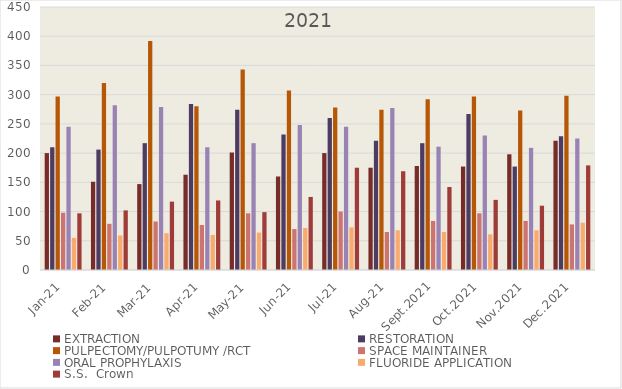
| Category | EXTRACTION | RESTORATION | PULPECTOMY/PULPOTUMY /RCT | SPACE MAINTAINER | ORAL PROPHYLAXIS | FLUORIDE APPLICATION | S.S.  Crown  |
|---|---|---|---|---|---|---|---|
| Jan-21 | 200 | 210 | 297 | 98 | 245 | 55 | 97 |
| Feb-21 | 151 | 206 | 320 | 79 | 282 | 59 | 102 |
| Mar-21 | 147 | 217 | 392 | 83 | 279 | 63 | 117 |
| Apr-21 | 163 | 284 | 280 | 77 | 210 | 60 | 119 |
| May-21 | 201 | 274 | 343 | 97 | 217 | 64 | 99 |
| Jun-21 | 160 | 232 | 307 | 70 | 248 | 72 | 125 |
| Jul-21 | 200 | 260 | 278 | 100 | 245 | 73 | 175 |
| Aug-21 | 175 | 221 | 274 | 65 | 277 | 68 | 169 |
| Sept.2021 | 178 | 217 | 292 | 84 | 211 | 65 | 142 |
| Oct.2021 | 177 | 267 | 297 | 97 | 230 | 61 | 120 |
| Nov.2021 | 198 | 177 | 273 | 84 | 209 | 68 | 110 |
| Dec.2021 | 221 | 229 | 298 | 78 | 225 | 81 | 179 |